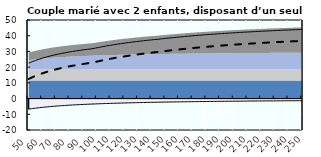
| Category | Coin fiscal moyen (somme des composantes) | Taux moyen d'imposition net en % du salaire brut |
|---|---|---|
| 50.0 | 22.542 | 12.473 |
| 51.0 | 22.916 | 12.895 |
| 52.0 | 23.275 | 13.301 |
| 53.0 | 23.621 | 13.691 |
| 54.0 | 23.954 | 14.067 |
| 55.0 | 24.274 | 14.43 |
| 56.0 | 24.584 | 14.779 |
| 57.0 | 24.882 | 15.117 |
| 58.0 | 25.17 | 15.442 |
| 59.0 | 25.448 | 15.757 |
| 60.0 | 25.717 | 16.061 |
| 61.0 | 25.978 | 16.355 |
| 62.0 | 26.23 | 16.639 |
| 63.0 | 26.473 | 16.915 |
| 64.0 | 26.71 | 17.182 |
| 65.0 | 26.939 | 17.441 |
| 66.0 | 27.161 | 17.692 |
| 67.0 | 27.376 | 17.935 |
| 68.0 | 27.585 | 18.171 |
| 69.0 | 27.788 | 18.401 |
| 70.0 | 27.985 | 18.623 |
| 71.0 | 28.177 | 18.84 |
| 72.0 | 28.363 | 19.051 |
| 73.0 | 28.545 | 19.255 |
| 74.0 | 28.721 | 19.455 |
| 75.0 | 28.893 | 19.649 |
| 76.0 | 29.06 | 19.837 |
| 77.0 | 29.222 | 20.021 |
| 78.0 | 29.381 | 20.201 |
| 79.0 | 29.536 | 20.375 |
| 80.0 | 29.686 | 20.546 |
| 81.0 | 29.833 | 20.712 |
| 82.0 | 29.977 | 20.874 |
| 83.0 | 30.117 | 21.032 |
| 84.0 | 30.253 | 21.186 |
| 85.0 | 30.387 | 21.337 |
| 86.0 | 30.517 | 21.484 |
| 87.0 | 30.644 | 21.628 |
| 88.0 | 30.769 | 21.769 |
| 89.0 | 30.89 | 21.906 |
| 90.0 | 31.009 | 22.04 |
| 91.0 | 31.126 | 22.172 |
| 92.0 | 31.239 | 22.3 |
| 93.0 | 31.351 | 22.426 |
| 94.0 | 31.46 | 22.549 |
| 95.0 | 31.566 | 22.67 |
| 96.0 | 31.671 | 22.788 |
| 97.0 | 31.803 | 22.937 |
| 98.0 | 31.988 | 23.146 |
| 99.0 | 32.169 | 23.351 |
| 100.0 | 32.346 | 23.551 |
| 101.0 | 32.52 | 23.748 |
| 102.0 | 32.691 | 23.941 |
| 103.0 | 32.858 | 24.129 |
| 104.0 | 33.022 | 24.315 |
| 105.0 | 33.183 | 24.497 |
| 106.0 | 33.341 | 24.675 |
| 107.0 | 33.495 | 24.85 |
| 108.0 | 33.647 | 25.022 |
| 109.0 | 33.797 | 25.19 |
| 110.0 | 33.943 | 25.356 |
| 111.0 | 34.087 | 25.518 |
| 112.0 | 34.228 | 25.678 |
| 113.0 | 34.367 | 25.835 |
| 114.0 | 34.503 | 25.989 |
| 115.0 | 34.637 | 26.14 |
| 116.0 | 34.769 | 26.289 |
| 117.0 | 34.899 | 26.435 |
| 118.0 | 35.026 | 26.579 |
| 119.0 | 35.151 | 26.72 |
| 120.0 | 35.274 | 26.859 |
| 121.0 | 35.395 | 26.996 |
| 122.0 | 35.514 | 27.131 |
| 123.0 | 35.631 | 27.263 |
| 124.0 | 35.746 | 27.393 |
| 125.0 | 35.859 | 27.521 |
| 126.0 | 35.971 | 27.647 |
| 127.0 | 36.081 | 27.771 |
| 128.0 | 36.189 | 27.893 |
| 129.0 | 36.295 | 28.013 |
| 130.0 | 36.4 | 28.132 |
| 131.0 | 36.503 | 28.248 |
| 132.0 | 36.605 | 28.363 |
| 133.0 | 36.705 | 28.476 |
| 134.0 | 36.803 | 28.588 |
| 135.0 | 36.9 | 28.697 |
| 136.0 | 36.996 | 28.805 |
| 137.0 | 37.09 | 28.912 |
| 138.0 | 37.183 | 29.017 |
| 139.0 | 37.275 | 29.12 |
| 140.0 | 37.365 | 29.222 |
| 141.0 | 37.454 | 29.323 |
| 142.0 | 37.542 | 29.422 |
| 143.0 | 37.628 | 29.52 |
| 144.0 | 37.713 | 29.616 |
| 145.0 | 37.798 | 29.711 |
| 146.0 | 37.89 | 29.815 |
| 147.0 | 37.989 | 29.928 |
| 148.0 | 38.088 | 30.039 |
| 149.0 | 38.185 | 30.149 |
| 150.0 | 38.281 | 30.258 |
| 151.0 | 38.376 | 30.364 |
| 152.0 | 38.469 | 30.47 |
| 153.0 | 38.561 | 30.574 |
| 154.0 | 38.652 | 30.677 |
| 155.0 | 38.742 | 30.778 |
| 156.0 | 38.83 | 30.878 |
| 157.0 | 38.918 | 30.977 |
| 158.0 | 39.004 | 31.075 |
| 159.0 | 39.09 | 31.171 |
| 160.0 | 39.174 | 31.266 |
| 161.0 | 39.257 | 31.36 |
| 162.0 | 39.339 | 31.453 |
| 163.0 | 39.42 | 31.545 |
| 164.0 | 39.501 | 31.636 |
| 165.0 | 39.58 | 31.725 |
| 166.0 | 39.658 | 31.813 |
| 167.0 | 39.735 | 31.901 |
| 168.0 | 39.812 | 31.987 |
| 169.0 | 39.887 | 32.072 |
| 170.0 | 39.962 | 32.157 |
| 171.0 | 40.035 | 32.24 |
| 172.0 | 40.108 | 32.322 |
| 173.0 | 40.18 | 32.404 |
| 174.0 | 40.251 | 32.484 |
| 175.0 | 40.322 | 32.564 |
| 176.0 | 40.391 | 32.642 |
| 177.0 | 40.46 | 32.72 |
| 178.0 | 40.528 | 32.797 |
| 179.0 | 40.595 | 32.873 |
| 180.0 | 40.662 | 32.948 |
| 181.0 | 40.728 | 33.022 |
| 182.0 | 40.793 | 33.096 |
| 183.0 | 40.857 | 33.168 |
| 184.0 | 40.921 | 33.24 |
| 185.0 | 40.984 | 33.312 |
| 186.0 | 41.046 | 33.382 |
| 187.0 | 41.108 | 33.452 |
| 188.0 | 41.168 | 33.52 |
| 189.0 | 41.229 | 33.589 |
| 190.0 | 41.288 | 33.656 |
| 191.0 | 41.348 | 33.723 |
| 192.0 | 41.406 | 33.789 |
| 193.0 | 41.464 | 33.854 |
| 194.0 | 41.521 | 33.919 |
| 195.0 | 41.578 | 33.983 |
| 196.0 | 41.634 | 34.046 |
| 197.0 | 41.689 | 34.109 |
| 198.0 | 41.744 | 34.171 |
| 199.0 | 41.799 | 34.232 |
| 200.0 | 41.852 | 34.293 |
| 201.0 | 41.906 | 34.353 |
| 202.0 | 41.958 | 34.413 |
| 203.0 | 42.011 | 34.472 |
| 204.0 | 42.062 | 34.531 |
| 205.0 | 42.114 | 34.588 |
| 206.0 | 42.164 | 34.646 |
| 207.0 | 42.215 | 34.703 |
| 208.0 | 42.264 | 34.759 |
| 209.0 | 42.314 | 34.815 |
| 210.0 | 42.363 | 34.87 |
| 211.0 | 42.411 | 34.924 |
| 212.0 | 42.459 | 34.978 |
| 213.0 | 42.506 | 35.032 |
| 214.0 | 42.553 | 35.085 |
| 215.0 | 42.6 | 35.138 |
| 216.0 | 42.646 | 35.19 |
| 217.0 | 42.692 | 35.242 |
| 218.0 | 42.737 | 35.293 |
| 219.0 | 42.782 | 35.344 |
| 220.0 | 42.826 | 35.394 |
| 221.0 | 42.87 | 35.444 |
| 222.0 | 42.914 | 35.493 |
| 223.0 | 42.957 | 35.542 |
| 224.0 | 43 | 35.59 |
| 225.0 | 43.043 | 35.638 |
| 226.0 | 43.085 | 35.686 |
| 227.0 | 43.127 | 35.733 |
| 228.0 | 43.168 | 35.78 |
| 229.0 | 43.209 | 35.826 |
| 230.0 | 43.25 | 35.872 |
| 231.0 | 43.29 | 35.918 |
| 232.0 | 43.33 | 35.963 |
| 233.0 | 43.37 | 36.008 |
| 234.0 | 43.409 | 36.052 |
| 235.0 | 43.448 | 36.096 |
| 236.0 | 43.487 | 36.14 |
| 237.0 | 43.525 | 36.183 |
| 238.0 | 43.563 | 36.226 |
| 239.0 | 43.601 | 36.269 |
| 240.0 | 43.638 | 36.311 |
| 241.0 | 43.675 | 36.353 |
| 242.0 | 43.712 | 36.394 |
| 243.0 | 43.748 | 36.436 |
| 244.0 | 43.784 | 36.476 |
| 245.0 | 43.82 | 36.517 |
| 246.0 | 43.856 | 36.557 |
| 247.0 | 43.891 | 36.597 |
| 248.0 | 43.926 | 36.636 |
| 249.0 | 43.961 | 36.676 |
| 250.0 | 43.995 | 36.715 |